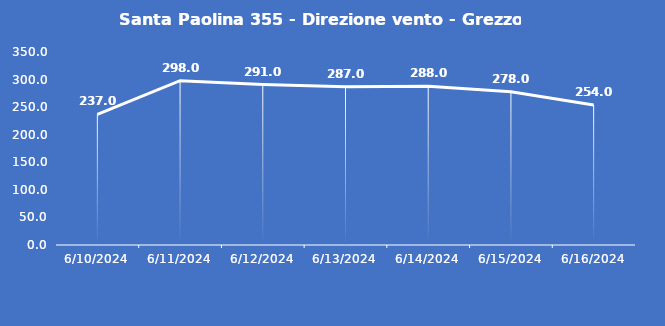
| Category | Santa Paolina 355 - Direzione vento - Grezzo (°N) |
|---|---|
| 6/10/24 | 237 |
| 6/11/24 | 298 |
| 6/12/24 | 291 |
| 6/13/24 | 287 |
| 6/14/24 | 288 |
| 6/15/24 | 278 |
| 6/16/24 | 254 |